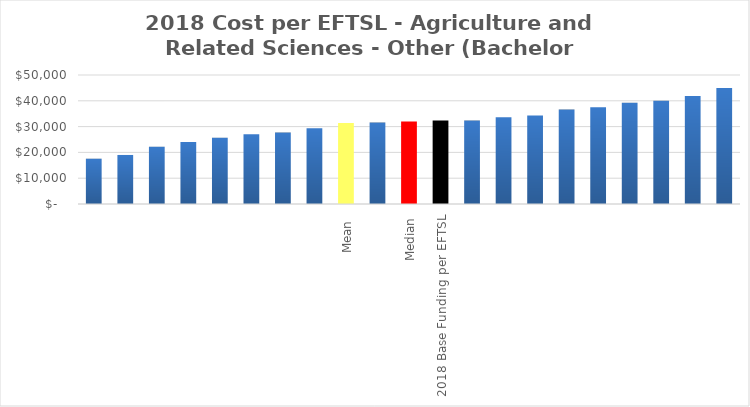
| Category | Series 0 |
|---|---|
|  | 17557.096 |
|  | 19005.064 |
|  | 22212.252 |
|  | 24061.814 |
|  | 25631.56 |
|  | 27071.714 |
|  | 27699.319 |
|  | 29326.961 |
| Mean  | 31367.045 |
|  | 31560.571 |
| Median | 31956.41 |
| 2018 Base Funding per EFTSL | 32336 |